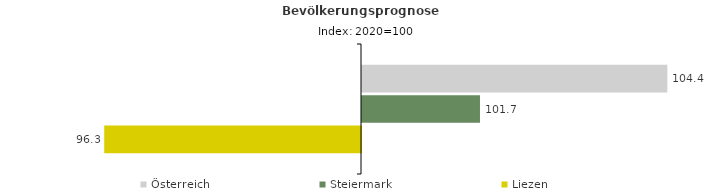
| Category | Österreich | Steiermark | Liezen |
|---|---|---|---|
| 2020.0 | 104.4 | 101.7 | 96.3 |